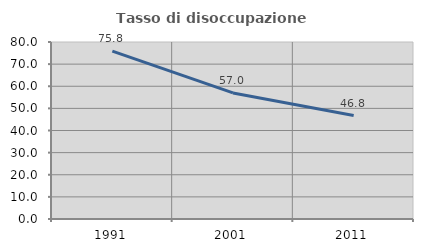
| Category | Tasso di disoccupazione giovanile  |
|---|---|
| 1991.0 | 75.845 |
| 2001.0 | 56.977 |
| 2011.0 | 46.774 |